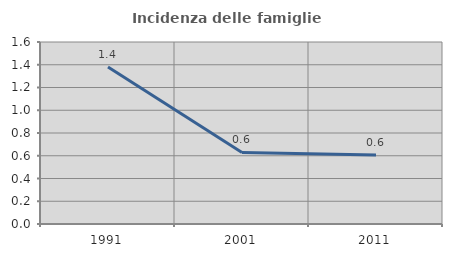
| Category | Incidenza delle famiglie numerose |
|---|---|
| 1991.0 | 1.379 |
| 2001.0 | 0.629 |
| 2011.0 | 0.606 |